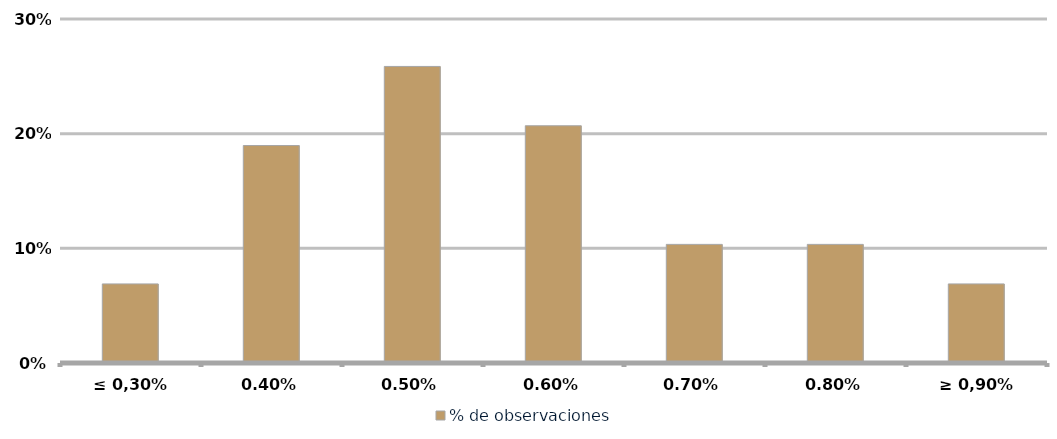
| Category | % de observaciones  |
|---|---|
| ≤ 0,30% | 0.069 |
| 0,40% | 0.19 |
| 0,50% | 0.259 |
| 0,60% | 0.207 |
| 0,70% | 0.103 |
| 0,80% | 0.103 |
| ≥ 0,90% | 0.069 |